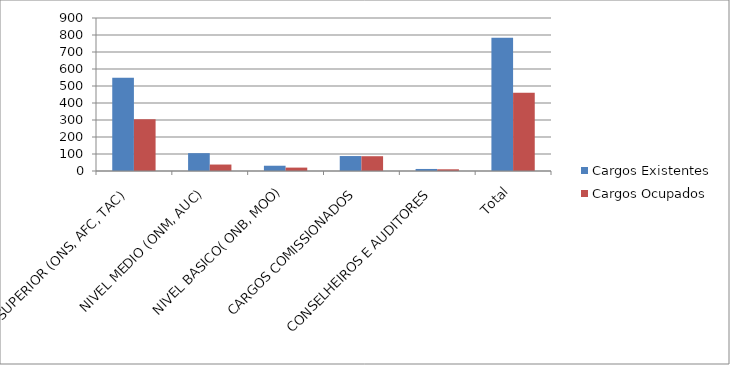
| Category | Cargos Existentes | Cargos Ocupados |
|---|---|---|
| NIVEL SUPERIOR (ONS, AFC, TAC) | 548 | 305 |
| NIVEL MEDIO (ONM, AUC) | 105 | 38 |
| NIVEL BASICO( ONB, MOO) | 31 | 20 |
| CARGOS COMISSIONADOS | 88 | 87 |
| CONSELHEIROS E AUDITORES | 12 | 10 |
| Total | 784 | 460 |